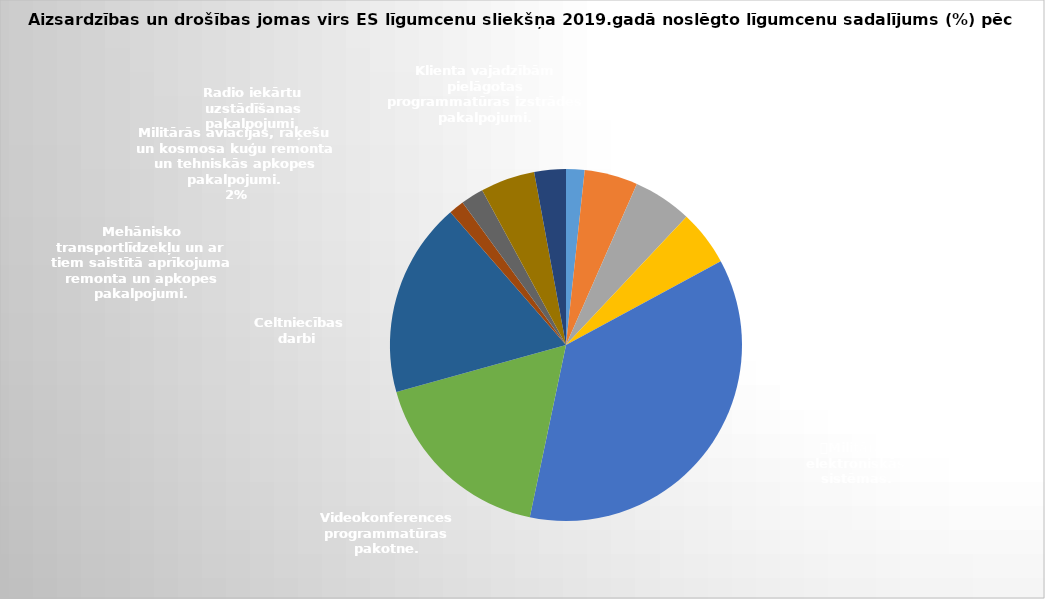
| Category | Series 0 |
|---|---|
| 0 | 0.017 |
| 1 | 0.049 |
| 2 | 0.054 |
| 3 | 0.051 |
| 4 | 0.362 |
| 5 | 0.174 |
| 6 | 0.179 |
| 7 | 0.014 |
| 8 | 0.021 |
| 9 | 0.05 |
| 10 | 0.029 |